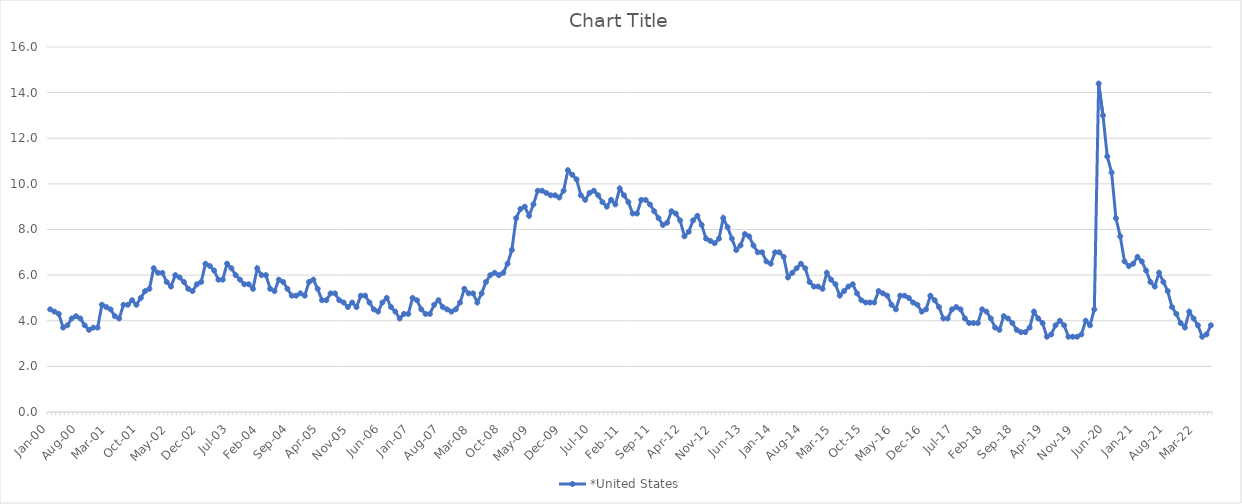
| Category | *United States | Alaska | Alabama | Arkansas | Arizona | California | Colorado | Connecticut | Delaware | Florida | Georgia | Hawaii | Iowa | Idaho | Illinois | Indiana | Kansas | Kentucky | Louisiana | Massachusetts | Maryland | Maine | Michigan | Minnesota | Missouri | Mississippi | Montana | North Carolina | North Dakota | Nebraska | New Hampshire | New Jersey | New Mexico | Nevada | New York | Ohio | Oklahoma | Oregon | Pennsylvania | Rhode Island | South Carolina | South Dakota | Tennessee | Texas | Utah | Virginia | Vermont | Washington | Wisconsin | West Virginia | Wyoming |
|---|---|---|---|---|---|---|---|---|---|---|---|---|---|---|---|---|---|---|---|---|---|---|---|---|---|---|---|---|---|---|---|---|---|---|---|---|---|---|---|---|---|---|---|---|---|---|---|---|---|---|---|
| Jan-00 | 4.5 |  |  |  |  |  |  |  |  |  |  |  |  |  |  |  |  |  |  |  |  |  |  |  |  |  |  |  |  |  |  |  |  |  |  |  |  |  |  |  |  |  |  |  |  |  |  |  |  |  |  |
| Feb-00 | 4.4 |  |  |  |  |  |  |  |  |  |  |  |  |  |  |  |  |  |  |  |  |  |  |  |  |  |  |  |  |  |  |  |  |  |  |  |  |  |  |  |  |  |  |  |  |  |  |  |  |  |  |
| Mar-00 | 4.3 |  |  |  |  |  |  |  |  |  |  |  |  |  |  |  |  |  |  |  |  |  |  |  |  |  |  |  |  |  |  |  |  |  |  |  |  |  |  |  |  |  |  |  |  |  |  |  |  |  |  |
| Apr-00 | 3.7 |  |  |  |  |  |  |  |  |  |  |  |  |  |  |  |  |  |  |  |  |  |  |  |  |  |  |  |  |  |  |  |  |  |  |  |  |  |  |  |  |  |  |  |  |  |  |  |  |  |  |
| May-00 | 3.8 |  |  |  |  |  |  |  |  |  |  |  |  |  |  |  |  |  |  |  |  |  |  |  |  |  |  |  |  |  |  |  |  |  |  |  |  |  |  |  |  |  |  |  |  |  |  |  |  |  |  |
| Jun-00 | 4.1 |  |  |  |  |  |  |  |  |  |  |  |  |  |  |  |  |  |  |  |  |  |  |  |  |  |  |  |  |  |  |  |  |  |  |  |  |  |  |  |  |  |  |  |  |  |  |  |  |  |  |
| Jul-00 | 4.2 |  |  |  |  |  |  |  |  |  |  |  |  |  |  |  |  |  |  |  |  |  |  |  |  |  |  |  |  |  |  |  |  |  |  |  |  |  |  |  |  |  |  |  |  |  |  |  |  |  |  |
| Aug-00 | 4.1 |  |  |  |  |  |  |  |  |  |  |  |  |  |  |  |  |  |  |  |  |  |  |  |  |  |  |  |  |  |  |  |  |  |  |  |  |  |  |  |  |  |  |  |  |  |  |  |  |  |  |
| Sep-00 | 3.8 |  |  |  |  |  |  |  |  |  |  |  |  |  |  |  |  |  |  |  |  |  |  |  |  |  |  |  |  |  |  |  |  |  |  |  |  |  |  |  |  |  |  |  |  |  |  |  |  |  |  |
| Oct-00 | 3.6 |  |  |  |  |  |  |  |  |  |  |  |  |  |  |  |  |  |  |  |  |  |  |  |  |  |  |  |  |  |  |  |  |  |  |  |  |  |  |  |  |  |  |  |  |  |  |  |  |  |  |
| Nov-00 | 3.7 |  |  |  |  |  |  |  |  |  |  |  |  |  |  |  |  |  |  |  |  |  |  |  |  |  |  |  |  |  |  |  |  |  |  |  |  |  |  |  |  |  |  |  |  |  |  |  |  |  |  |
| Dec-00 | 3.7 |  |  |  |  |  |  |  |  |  |  |  |  |  |  |  |  |  |  |  |  |  |  |  |  |  |  |  |  |  |  |  |  |  |  |  |  |  |  |  |  |  |  |  |  |  |  |  |  |  |  |
| Jan-01 | 4.7 |  |  |  |  |  |  |  |  |  |  |  |  |  |  |  |  |  |  |  |  |  |  |  |  |  |  |  |  |  |  |  |  |  |  |  |  |  |  |  |  |  |  |  |  |  |  |  |  |  |  |
| Feb-01 | 4.6 |  |  |  |  |  |  |  |  |  |  |  |  |  |  |  |  |  |  |  |  |  |  |  |  |  |  |  |  |  |  |  |  |  |  |  |  |  |  |  |  |  |  |  |  |  |  |  |  |  |  |
| Mar-01 | 4.5 |  |  |  |  |  |  |  |  |  |  |  |  |  |  |  |  |  |  |  |  |  |  |  |  |  |  |  |  |  |  |  |  |  |  |  |  |  |  |  |  |  |  |  |  |  |  |  |  |  |  |
| Apr-01 | 4.2 |  |  |  |  |  |  |  |  |  |  |  |  |  |  |  |  |  |  |  |  |  |  |  |  |  |  |  |  |  |  |  |  |  |  |  |  |  |  |  |  |  |  |  |  |  |  |  |  |  |  |
| May-01 | 4.1 |  |  |  |  |  |  |  |  |  |  |  |  |  |  |  |  |  |  |  |  |  |  |  |  |  |  |  |  |  |  |  |  |  |  |  |  |  |  |  |  |  |  |  |  |  |  |  |  |  |  |
| Jun-01 | 4.7 |  |  |  |  |  |  |  |  |  |  |  |  |  |  |  |  |  |  |  |  |  |  |  |  |  |  |  |  |  |  |  |  |  |  |  |  |  |  |  |  |  |  |  |  |  |  |  |  |  |  |
| Jul-01 | 4.7 |  |  |  |  |  |  |  |  |  |  |  |  |  |  |  |  |  |  |  |  |  |  |  |  |  |  |  |  |  |  |  |  |  |  |  |  |  |  |  |  |  |  |  |  |  |  |  |  |  |  |
| Aug-01 | 4.9 |  |  |  |  |  |  |  |  |  |  |  |  |  |  |  |  |  |  |  |  |  |  |  |  |  |  |  |  |  |  |  |  |  |  |  |  |  |  |  |  |  |  |  |  |  |  |  |  |  |  |
| Sep-01 | 4.7 |  |  |  |  |  |  |  |  |  |  |  |  |  |  |  |  |  |  |  |  |  |  |  |  |  |  |  |  |  |  |  |  |  |  |  |  |  |  |  |  |  |  |  |  |  |  |  |  |  |  |
| Oct-01 | 5 |  |  |  |  |  |  |  |  |  |  |  |  |  |  |  |  |  |  |  |  |  |  |  |  |  |  |  |  |  |  |  |  |  |  |  |  |  |  |  |  |  |  |  |  |  |  |  |  |  |  |
| Nov-01 | 5.3 |  |  |  |  |  |  |  |  |  |  |  |  |  |  |  |  |  |  |  |  |  |  |  |  |  |  |  |  |  |  |  |  |  |  |  |  |  |  |  |  |  |  |  |  |  |  |  |  |  |  |
| Dec-01 | 5.4 |  |  |  |  |  |  |  |  |  |  |  |  |  |  |  |  |  |  |  |  |  |  |  |  |  |  |  |  |  |  |  |  |  |  |  |  |  |  |  |  |  |  |  |  |  |  |  |  |  |  |
| Jan-02 | 6.3 |  |  |  |  |  |  |  |  |  |  |  |  |  |  |  |  |  |  |  |  |  |  |  |  |  |  |  |  |  |  |  |  |  |  |  |  |  |  |  |  |  |  |  |  |  |  |  |  |  |  |
| Feb-02 | 6.1 |  |  |  |  |  |  |  |  |  |  |  |  |  |  |  |  |  |  |  |  |  |  |  |  |  |  |  |  |  |  |  |  |  |  |  |  |  |  |  |  |  |  |  |  |  |  |  |  |  |  |
| Mar-02 | 6.1 |  |  |  |  |  |  |  |  |  |  |  |  |  |  |  |  |  |  |  |  |  |  |  |  |  |  |  |  |  |  |  |  |  |  |  |  |  |  |  |  |  |  |  |  |  |  |  |  |  |  |
| Apr-02 | 5.7 |  |  |  |  |  |  |  |  |  |  |  |  |  |  |  |  |  |  |  |  |  |  |  |  |  |  |  |  |  |  |  |  |  |  |  |  |  |  |  |  |  |  |  |  |  |  |  |  |  |  |
| May-02 | 5.5 |  |  |  |  |  |  |  |  |  |  |  |  |  |  |  |  |  |  |  |  |  |  |  |  |  |  |  |  |  |  |  |  |  |  |  |  |  |  |  |  |  |  |  |  |  |  |  |  |  |  |
| Jun-02 | 6 |  |  |  |  |  |  |  |  |  |  |  |  |  |  |  |  |  |  |  |  |  |  |  |  |  |  |  |  |  |  |  |  |  |  |  |  |  |  |  |  |  |  |  |  |  |  |  |  |  |  |
| Jul-02 | 5.9 |  |  |  |  |  |  |  |  |  |  |  |  |  |  |  |  |  |  |  |  |  |  |  |  |  |  |  |  |  |  |  |  |  |  |  |  |  |  |  |  |  |  |  |  |  |  |  |  |  |  |
| Aug-02 | 5.7 |  |  |  |  |  |  |  |  |  |  |  |  |  |  |  |  |  |  |  |  |  |  |  |  |  |  |  |  |  |  |  |  |  |  |  |  |  |  |  |  |  |  |  |  |  |  |  |  |  |  |
| Sep-02 | 5.4 |  |  |  |  |  |  |  |  |  |  |  |  |  |  |  |  |  |  |  |  |  |  |  |  |  |  |  |  |  |  |  |  |  |  |  |  |  |  |  |  |  |  |  |  |  |  |  |  |  |  |
| Oct-02 | 5.3 |  |  |  |  |  |  |  |  |  |  |  |  |  |  |  |  |  |  |  |  |  |  |  |  |  |  |  |  |  |  |  |  |  |  |  |  |  |  |  |  |  |  |  |  |  |  |  |  |  |  |
| Nov-02 | 5.6 |  |  |  |  |  |  |  |  |  |  |  |  |  |  |  |  |  |  |  |  |  |  |  |  |  |  |  |  |  |  |  |  |  |  |  |  |  |  |  |  |  |  |  |  |  |  |  |  |  |  |
| Dec-02 | 5.7 |  |  |  |  |  |  |  |  |  |  |  |  |  |  |  |  |  |  |  |  |  |  |  |  |  |  |  |  |  |  |  |  |  |  |  |  |  |  |  |  |  |  |  |  |  |  |  |  |  |  |
| Jan-03 | 6.5 |  |  |  |  |  |  |  |  |  |  |  |  |  |  |  |  |  |  |  |  |  |  |  |  |  |  |  |  |  |  |  |  |  |  |  |  |  |  |  |  |  |  |  |  |  |  |  |  |  |  |
| Feb-03 | 6.4 |  |  |  |  |  |  |  |  |  |  |  |  |  |  |  |  |  |  |  |  |  |  |  |  |  |  |  |  |  |  |  |  |  |  |  |  |  |  |  |  |  |  |  |  |  |  |  |  |  |  |
| Mar-03 | 6.2 |  |  |  |  |  |  |  |  |  |  |  |  |  |  |  |  |  |  |  |  |  |  |  |  |  |  |  |  |  |  |  |  |  |  |  |  |  |  |  |  |  |  |  |  |  |  |  |  |  |  |
| Apr-03 | 5.8 |  |  |  |  |  |  |  |  |  |  |  |  |  |  |  |  |  |  |  |  |  |  |  |  |  |  |  |  |  |  |  |  |  |  |  |  |  |  |  |  |  |  |  |  |  |  |  |  |  |  |
| May-03 | 5.8 |  |  |  |  |  |  |  |  |  |  |  |  |  |  |  |  |  |  |  |  |  |  |  |  |  |  |  |  |  |  |  |  |  |  |  |  |  |  |  |  |  |  |  |  |  |  |  |  |  |  |
| Jun-03 | 6.5 |  |  |  |  |  |  |  |  |  |  |  |  |  |  |  |  |  |  |  |  |  |  |  |  |  |  |  |  |  |  |  |  |  |  |  |  |  |  |  |  |  |  |  |  |  |  |  |  |  |  |
| Jul-03 | 6.3 |  |  |  |  |  |  |  |  |  |  |  |  |  |  |  |  |  |  |  |  |  |  |  |  |  |  |  |  |  |  |  |  |  |  |  |  |  |  |  |  |  |  |  |  |  |  |  |  |  |  |
| Aug-03 | 6 |  |  |  |  |  |  |  |  |  |  |  |  |  |  |  |  |  |  |  |  |  |  |  |  |  |  |  |  |  |  |  |  |  |  |  |  |  |  |  |  |  |  |  |  |  |  |  |  |  |  |
| Sep-03 | 5.8 |  |  |  |  |  |  |  |  |  |  |  |  |  |  |  |  |  |  |  |  |  |  |  |  |  |  |  |  |  |  |  |  |  |  |  |  |  |  |  |  |  |  |  |  |  |  |  |  |  |  |
| Oct-03 | 5.6 |  |  |  |  |  |  |  |  |  |  |  |  |  |  |  |  |  |  |  |  |  |  |  |  |  |  |  |  |  |  |  |  |  |  |  |  |  |  |  |  |  |  |  |  |  |  |  |  |  |  |
| Nov-03 | 5.6 |  |  |  |  |  |  |  |  |  |  |  |  |  |  |  |  |  |  |  |  |  |  |  |  |  |  |  |  |  |  |  |  |  |  |  |  |  |  |  |  |  |  |  |  |  |  |  |  |  |  |
| Dec-03 | 5.4 |  |  |  |  |  |  |  |  |  |  |  |  |  |  |  |  |  |  |  |  |  |  |  |  |  |  |  |  |  |  |  |  |  |  |  |  |  |  |  |  |  |  |  |  |  |  |  |  |  |  |
| Jan-04 | 6.3 |  |  |  |  |  |  |  |  |  |  |  |  |  |  |  |  |  |  |  |  |  |  |  |  |  |  |  |  |  |  |  |  |  |  |  |  |  |  |  |  |  |  |  |  |  |  |  |  |  |  |
| Feb-04 | 6 |  |  |  |  |  |  |  |  |  |  |  |  |  |  |  |  |  |  |  |  |  |  |  |  |  |  |  |  |  |  |  |  |  |  |  |  |  |  |  |  |  |  |  |  |  |  |  |  |  |  |
| Mar-04 | 6 |  |  |  |  |  |  |  |  |  |  |  |  |  |  |  |  |  |  |  |  |  |  |  |  |  |  |  |  |  |  |  |  |  |  |  |  |  |  |  |  |  |  |  |  |  |  |  |  |  |  |
| Apr-04 | 5.4 |  |  |  |  |  |  |  |  |  |  |  |  |  |  |  |  |  |  |  |  |  |  |  |  |  |  |  |  |  |  |  |  |  |  |  |  |  |  |  |  |  |  |  |  |  |  |  |  |  |  |
| May-04 | 5.3 |  |  |  |  |  |  |  |  |  |  |  |  |  |  |  |  |  |  |  |  |  |  |  |  |  |  |  |  |  |  |  |  |  |  |  |  |  |  |  |  |  |  |  |  |  |  |  |  |  |  |
| Jun-04 | 5.8 |  |  |  |  |  |  |  |  |  |  |  |  |  |  |  |  |  |  |  |  |  |  |  |  |  |  |  |  |  |  |  |  |  |  |  |  |  |  |  |  |  |  |  |  |  |  |  |  |  |  |
| Jul-04 | 5.7 |  |  |  |  |  |  |  |  |  |  |  |  |  |  |  |  |  |  |  |  |  |  |  |  |  |  |  |  |  |  |  |  |  |  |  |  |  |  |  |  |  |  |  |  |  |  |  |  |  |  |
| Aug-04 | 5.4 |  |  |  |  |  |  |  |  |  |  |  |  |  |  |  |  |  |  |  |  |  |  |  |  |  |  |  |  |  |  |  |  |  |  |  |  |  |  |  |  |  |  |  |  |  |  |  |  |  |  |
| Sep-04 | 5.1 |  |  |  |  |  |  |  |  |  |  |  |  |  |  |  |  |  |  |  |  |  |  |  |  |  |  |  |  |  |  |  |  |  |  |  |  |  |  |  |  |  |  |  |  |  |  |  |  |  |  |
| Oct-04 | 5.1 |  |  |  |  |  |  |  |  |  |  |  |  |  |  |  |  |  |  |  |  |  |  |  |  |  |  |  |  |  |  |  |  |  |  |  |  |  |  |  |  |  |  |  |  |  |  |  |  |  |  |
| Nov-04 | 5.2 |  |  |  |  |  |  |  |  |  |  |  |  |  |  |  |  |  |  |  |  |  |  |  |  |  |  |  |  |  |  |  |  |  |  |  |  |  |  |  |  |  |  |  |  |  |  |  |  |  |  |
| Dec-04 | 5.1 |  |  |  |  |  |  |  |  |  |  |  |  |  |  |  |  |  |  |  |  |  |  |  |  |  |  |  |  |  |  |  |  |  |  |  |  |  |  |  |  |  |  |  |  |  |  |  |  |  |  |
| Jan-05 | 5.7 |  |  |  |  |  |  |  |  |  |  |  |  |  |  |  |  |  |  |  |  |  |  |  |  |  |  |  |  |  |  |  |  |  |  |  |  |  |  |  |  |  |  |  |  |  |  |  |  |  |  |
| Feb-05 | 5.8 |  |  |  |  |  |  |  |  |  |  |  |  |  |  |  |  |  |  |  |  |  |  |  |  |  |  |  |  |  |  |  |  |  |  |  |  |  |  |  |  |  |  |  |  |  |  |  |  |  |  |
| Mar-05 | 5.4 |  |  |  |  |  |  |  |  |  |  |  |  |  |  |  |  |  |  |  |  |  |  |  |  |  |  |  |  |  |  |  |  |  |  |  |  |  |  |  |  |  |  |  |  |  |  |  |  |  |  |
| Apr-05 | 4.9 |  |  |  |  |  |  |  |  |  |  |  |  |  |  |  |  |  |  |  |  |  |  |  |  |  |  |  |  |  |  |  |  |  |  |  |  |  |  |  |  |  |  |  |  |  |  |  |  |  |  |
| May-05 | 4.9 |  |  |  |  |  |  |  |  |  |  |  |  |  |  |  |  |  |  |  |  |  |  |  |  |  |  |  |  |  |  |  |  |  |  |  |  |  |  |  |  |  |  |  |  |  |  |  |  |  |  |
| Jun-05 | 5.2 |  |  |  |  |  |  |  |  |  |  |  |  |  |  |  |  |  |  |  |  |  |  |  |  |  |  |  |  |  |  |  |  |  |  |  |  |  |  |  |  |  |  |  |  |  |  |  |  |  |  |
| Jul-05 | 5.2 |  |  |  |  |  |  |  |  |  |  |  |  |  |  |  |  |  |  |  |  |  |  |  |  |  |  |  |  |  |  |  |  |  |  |  |  |  |  |  |  |  |  |  |  |  |  |  |  |  |  |
| Aug-05 | 4.9 |  |  |  |  |  |  |  |  |  |  |  |  |  |  |  |  |  |  |  |  |  |  |  |  |  |  |  |  |  |  |  |  |  |  |  |  |  |  |  |  |  |  |  |  |  |  |  |  |  |  |
| Sep-05 | 4.8 |  |  |  |  |  |  |  |  |  |  |  |  |  |  |  |  |  |  |  |  |  |  |  |  |  |  |  |  |  |  |  |  |  |  |  |  |  |  |  |  |  |  |  |  |  |  |  |  |  |  |
| Oct-05 | 4.6 |  |  |  |  |  |  |  |  |  |  |  |  |  |  |  |  |  |  |  |  |  |  |  |  |  |  |  |  |  |  |  |  |  |  |  |  |  |  |  |  |  |  |  |  |  |  |  |  |  |  |
| Nov-05 | 4.8 |  |  |  |  |  |  |  |  |  |  |  |  |  |  |  |  |  |  |  |  |  |  |  |  |  |  |  |  |  |  |  |  |  |  |  |  |  |  |  |  |  |  |  |  |  |  |  |  |  |  |
| Dec-05 | 4.6 |  |  |  |  |  |  |  |  |  |  |  |  |  |  |  |  |  |  |  |  |  |  |  |  |  |  |  |  |  |  |  |  |  |  |  |  |  |  |  |  |  |  |  |  |  |  |  |  |  |  |
| Jan-06 | 5.1 |  |  |  |  |  |  |  |  |  |  |  |  |  |  |  |  |  |  |  |  |  |  |  |  |  |  |  |  |  |  |  |  |  |  |  |  |  |  |  |  |  |  |  |  |  |  |  |  |  |  |
| Feb-06 | 5.1 |  |  |  |  |  |  |  |  |  |  |  |  |  |  |  |  |  |  |  |  |  |  |  |  |  |  |  |  |  |  |  |  |  |  |  |  |  |  |  |  |  |  |  |  |  |  |  |  |  |  |
| Mar-06 | 4.8 |  |  |  |  |  |  |  |  |  |  |  |  |  |  |  |  |  |  |  |  |  |  |  |  |  |  |  |  |  |  |  |  |  |  |  |  |  |  |  |  |  |  |  |  |  |  |  |  |  |  |
| Apr-06 | 4.5 |  |  |  |  |  |  |  |  |  |  |  |  |  |  |  |  |  |  |  |  |  |  |  |  |  |  |  |  |  |  |  |  |  |  |  |  |  |  |  |  |  |  |  |  |  |  |  |  |  |  |
| May-06 | 4.4 |  |  |  |  |  |  |  |  |  |  |  |  |  |  |  |  |  |  |  |  |  |  |  |  |  |  |  |  |  |  |  |  |  |  |  |  |  |  |  |  |  |  |  |  |  |  |  |  |  |  |
| Jun-06 | 4.8 |  |  |  |  |  |  |  |  |  |  |  |  |  |  |  |  |  |  |  |  |  |  |  |  |  |  |  |  |  |  |  |  |  |  |  |  |  |  |  |  |  |  |  |  |  |  |  |  |  |  |
| Jul-06 | 5 |  |  |  |  |  |  |  |  |  |  |  |  |  |  |  |  |  |  |  |  |  |  |  |  |  |  |  |  |  |  |  |  |  |  |  |  |  |  |  |  |  |  |  |  |  |  |  |  |  |  |
| Aug-06 | 4.6 |  |  |  |  |  |  |  |  |  |  |  |  |  |  |  |  |  |  |  |  |  |  |  |  |  |  |  |  |  |  |  |  |  |  |  |  |  |  |  |  |  |  |  |  |  |  |  |  |  |  |
| Sep-06 | 4.4 |  |  |  |  |  |  |  |  |  |  |  |  |  |  |  |  |  |  |  |  |  |  |  |  |  |  |  |  |  |  |  |  |  |  |  |  |  |  |  |  |  |  |  |  |  |  |  |  |  |  |
| Oct-06 | 4.1 |  |  |  |  |  |  |  |  |  |  |  |  |  |  |  |  |  |  |  |  |  |  |  |  |  |  |  |  |  |  |  |  |  |  |  |  |  |  |  |  |  |  |  |  |  |  |  |  |  |  |
| Nov-06 | 4.3 |  |  |  |  |  |  |  |  |  |  |  |  |  |  |  |  |  |  |  |  |  |  |  |  |  |  |  |  |  |  |  |  |  |  |  |  |  |  |  |  |  |  |  |  |  |  |  |  |  |  |
| Dec-06 | 4.3 |  |  |  |  |  |  |  |  |  |  |  |  |  |  |  |  |  |  |  |  |  |  |  |  |  |  |  |  |  |  |  |  |  |  |  |  |  |  |  |  |  |  |  |  |  |  |  |  |  |  |
| Jan-07 | 5 |  |  |  |  |  |  |  |  |  |  |  |  |  |  |  |  |  |  |  |  |  |  |  |  |  |  |  |  |  |  |  |  |  |  |  |  |  |  |  |  |  |  |  |  |  |  |  |  |  |  |
| Feb-07 | 4.9 |  |  |  |  |  |  |  |  |  |  |  |  |  |  |  |  |  |  |  |  |  |  |  |  |  |  |  |  |  |  |  |  |  |  |  |  |  |  |  |  |  |  |  |  |  |  |  |  |  |  |
| Mar-07 | 4.5 |  |  |  |  |  |  |  |  |  |  |  |  |  |  |  |  |  |  |  |  |  |  |  |  |  |  |  |  |  |  |  |  |  |  |  |  |  |  |  |  |  |  |  |  |  |  |  |  |  |  |
| Apr-07 | 4.3 |  |  |  |  |  |  |  |  |  |  |  |  |  |  |  |  |  |  |  |  |  |  |  |  |  |  |  |  |  |  |  |  |  |  |  |  |  |  |  |  |  |  |  |  |  |  |  |  |  |  |
| May-07 | 4.3 |  |  |  |  |  |  |  |  |  |  |  |  |  |  |  |  |  |  |  |  |  |  |  |  |  |  |  |  |  |  |  |  |  |  |  |  |  |  |  |  |  |  |  |  |  |  |  |  |  |  |
| Jun-07 | 4.7 |  |  |  |  |  |  |  |  |  |  |  |  |  |  |  |  |  |  |  |  |  |  |  |  |  |  |  |  |  |  |  |  |  |  |  |  |  |  |  |  |  |  |  |  |  |  |  |  |  |  |
| Jul-07 | 4.9 |  |  |  |  |  |  |  |  |  |  |  |  |  |  |  |  |  |  |  |  |  |  |  |  |  |  |  |  |  |  |  |  |  |  |  |  |  |  |  |  |  |  |  |  |  |  |  |  |  |  |
| Aug-07 | 4.6 |  |  |  |  |  |  |  |  |  |  |  |  |  |  |  |  |  |  |  |  |  |  |  |  |  |  |  |  |  |  |  |  |  |  |  |  |  |  |  |  |  |  |  |  |  |  |  |  |  |  |
| Sep-07 | 4.5 |  |  |  |  |  |  |  |  |  |  |  |  |  |  |  |  |  |  |  |  |  |  |  |  |  |  |  |  |  |  |  |  |  |  |  |  |  |  |  |  |  |  |  |  |  |  |  |  |  |  |
| Oct-07 | 4.4 |  |  |  |  |  |  |  |  |  |  |  |  |  |  |  |  |  |  |  |  |  |  |  |  |  |  |  |  |  |  |  |  |  |  |  |  |  |  |  |  |  |  |  |  |  |  |  |  |  |  |
| Nov-07 | 4.5 |  |  |  |  |  |  |  |  |  |  |  |  |  |  |  |  |  |  |  |  |  |  |  |  |  |  |  |  |  |  |  |  |  |  |  |  |  |  |  |  |  |  |  |  |  |  |  |  |  |  |
| Dec-07 | 4.8 |  |  |  |  |  |  |  |  |  |  |  |  |  |  |  |  |  |  |  |  |  |  |  |  |  |  |  |  |  |  |  |  |  |  |  |  |  |  |  |  |  |  |  |  |  |  |  |  |  |  |
| Jan-08 | 5.4 |  |  |  |  |  |  |  |  |  |  |  |  |  |  |  |  |  |  |  |  |  |  |  |  |  |  |  |  |  |  |  |  |  |  |  |  |  |  |  |  |  |  |  |  |  |  |  |  |  |  |
| Feb-08 | 5.2 |  |  |  |  |  |  |  |  |  |  |  |  |  |  |  |  |  |  |  |  |  |  |  |  |  |  |  |  |  |  |  |  |  |  |  |  |  |  |  |  |  |  |  |  |  |  |  |  |  |  |
| Mar-08 | 5.2 |  |  |  |  |  |  |  |  |  |  |  |  |  |  |  |  |  |  |  |  |  |  |  |  |  |  |  |  |  |  |  |  |  |  |  |  |  |  |  |  |  |  |  |  |  |  |  |  |  |  |
| Apr-08 | 4.8 |  |  |  |  |  |  |  |  |  |  |  |  |  |  |  |  |  |  |  |  |  |  |  |  |  |  |  |  |  |  |  |  |  |  |  |  |  |  |  |  |  |  |  |  |  |  |  |  |  |  |
| May-08 | 5.2 |  |  |  |  |  |  |  |  |  |  |  |  |  |  |  |  |  |  |  |  |  |  |  |  |  |  |  |  |  |  |  |  |  |  |  |  |  |  |  |  |  |  |  |  |  |  |  |  |  |  |
| Jun-08 | 5.7 |  |  |  |  |  |  |  |  |  |  |  |  |  |  |  |  |  |  |  |  |  |  |  |  |  |  |  |  |  |  |  |  |  |  |  |  |  |  |  |  |  |  |  |  |  |  |  |  |  |  |
| Jul-08 | 6 |  |  |  |  |  |  |  |  |  |  |  |  |  |  |  |  |  |  |  |  |  |  |  |  |  |  |  |  |  |  |  |  |  |  |  |  |  |  |  |  |  |  |  |  |  |  |  |  |  |  |
| Aug-08 | 6.1 |  |  |  |  |  |  |  |  |  |  |  |  |  |  |  |  |  |  |  |  |  |  |  |  |  |  |  |  |  |  |  |  |  |  |  |  |  |  |  |  |  |  |  |  |  |  |  |  |  |  |
| Sep-08 | 6 |  |  |  |  |  |  |  |  |  |  |  |  |  |  |  |  |  |  |  |  |  |  |  |  |  |  |  |  |  |  |  |  |  |  |  |  |  |  |  |  |  |  |  |  |  |  |  |  |  |  |
| Oct-08 | 6.1 |  |  |  |  |  |  |  |  |  |  |  |  |  |  |  |  |  |  |  |  |  |  |  |  |  |  |  |  |  |  |  |  |  |  |  |  |  |  |  |  |  |  |  |  |  |  |  |  |  |  |
| Nov-08 | 6.5 |  |  |  |  |  |  |  |  |  |  |  |  |  |  |  |  |  |  |  |  |  |  |  |  |  |  |  |  |  |  |  |  |  |  |  |  |  |  |  |  |  |  |  |  |  |  |  |  |  |  |
| Dec-08 | 7.1 |  |  |  |  |  |  |  |  |  |  |  |  |  |  |  |  |  |  |  |  |  |  |  |  |  |  |  |  |  |  |  |  |  |  |  |  |  |  |  |  |  |  |  |  |  |  |  |  |  |  |
| Jan-09 | 8.5 |  |  |  |  |  |  |  |  |  |  |  |  |  |  |  |  |  |  |  |  |  |  |  |  |  |  |  |  |  |  |  |  |  |  |  |  |  |  |  |  |  |  |  |  |  |  |  |  |  |  |
| Feb-09 | 8.9 |  |  |  |  |  |  |  |  |  |  |  |  |  |  |  |  |  |  |  |  |  |  |  |  |  |  |  |  |  |  |  |  |  |  |  |  |  |  |  |  |  |  |  |  |  |  |  |  |  |  |
| Mar-09 | 9 |  |  |  |  |  |  |  |  |  |  |  |  |  |  |  |  |  |  |  |  |  |  |  |  |  |  |  |  |  |  |  |  |  |  |  |  |  |  |  |  |  |  |  |  |  |  |  |  |  |  |
| Apr-09 | 8.6 |  |  |  |  |  |  |  |  |  |  |  |  |  |  |  |  |  |  |  |  |  |  |  |  |  |  |  |  |  |  |  |  |  |  |  |  |  |  |  |  |  |  |  |  |  |  |  |  |  |  |
| May-09 | 9.1 |  |  |  |  |  |  |  |  |  |  |  |  |  |  |  |  |  |  |  |  |  |  |  |  |  |  |  |  |  |  |  |  |  |  |  |  |  |  |  |  |  |  |  |  |  |  |  |  |  |  |
| Jun-09 | 9.7 |  |  |  |  |  |  |  |  |  |  |  |  |  |  |  |  |  |  |  |  |  |  |  |  |  |  |  |  |  |  |  |  |  |  |  |  |  |  |  |  |  |  |  |  |  |  |  |  |  |  |
| Jul-09 | 9.7 |  |  |  |  |  |  |  |  |  |  |  |  |  |  |  |  |  |  |  |  |  |  |  |  |  |  |  |  |  |  |  |  |  |  |  |  |  |  |  |  |  |  |  |  |  |  |  |  |  |  |
| Aug-09 | 9.6 |  |  |  |  |  |  |  |  |  |  |  |  |  |  |  |  |  |  |  |  |  |  |  |  |  |  |  |  |  |  |  |  |  |  |  |  |  |  |  |  |  |  |  |  |  |  |  |  |  |  |
| Sep-09 | 9.5 |  |  |  |  |  |  |  |  |  |  |  |  |  |  |  |  |  |  |  |  |  |  |  |  |  |  |  |  |  |  |  |  |  |  |  |  |  |  |  |  |  |  |  |  |  |  |  |  |  |  |
| Oct-09 | 9.5 |  |  |  |  |  |  |  |  |  |  |  |  |  |  |  |  |  |  |  |  |  |  |  |  |  |  |  |  |  |  |  |  |  |  |  |  |  |  |  |  |  |  |  |  |  |  |  |  |  |  |
| Nov-09 | 9.4 |  |  |  |  |  |  |  |  |  |  |  |  |  |  |  |  |  |  |  |  |  |  |  |  |  |  |  |  |  |  |  |  |  |  |  |  |  |  |  |  |  |  |  |  |  |  |  |  |  |  |
| Dec-09 | 9.7 |  |  |  |  |  |  |  |  |  |  |  |  |  |  |  |  |  |  |  |  |  |  |  |  |  |  |  |  |  |  |  |  |  |  |  |  |  |  |  |  |  |  |  |  |  |  |  |  |  |  |
| Jan-10 | 10.6 |  |  |  |  |  |  |  |  |  |  |  |  |  |  |  |  |  |  |  |  |  |  |  |  |  |  |  |  |  |  |  |  |  |  |  |  |  |  |  |  |  |  |  |  |  |  |  |  |  |  |
| Feb-10 | 10.4 |  |  |  |  |  |  |  |  |  |  |  |  |  |  |  |  |  |  |  |  |  |  |  |  |  |  |  |  |  |  |  |  |  |  |  |  |  |  |  |  |  |  |  |  |  |  |  |  |  |  |
| Mar-10 | 10.2 |  |  |  |  |  |  |  |  |  |  |  |  |  |  |  |  |  |  |  |  |  |  |  |  |  |  |  |  |  |  |  |  |  |  |  |  |  |  |  |  |  |  |  |  |  |  |  |  |  |  |
| Apr-10 | 9.5 |  |  |  |  |  |  |  |  |  |  |  |  |  |  |  |  |  |  |  |  |  |  |  |  |  |  |  |  |  |  |  |  |  |  |  |  |  |  |  |  |  |  |  |  |  |  |  |  |  |  |
| May-10 | 9.3 |  |  |  |  |  |  |  |  |  |  |  |  |  |  |  |  |  |  |  |  |  |  |  |  |  |  |  |  |  |  |  |  |  |  |  |  |  |  |  |  |  |  |  |  |  |  |  |  |  |  |
| Jun-10 | 9.6 |  |  |  |  |  |  |  |  |  |  |  |  |  |  |  |  |  |  |  |  |  |  |  |  |  |  |  |  |  |  |  |  |  |  |  |  |  |  |  |  |  |  |  |  |  |  |  |  |  |  |
| Jul-10 | 9.7 |  |  |  |  |  |  |  |  |  |  |  |  |  |  |  |  |  |  |  |  |  |  |  |  |  |  |  |  |  |  |  |  |  |  |  |  |  |  |  |  |  |  |  |  |  |  |  |  |  |  |
| Aug-10 | 9.5 |  |  |  |  |  |  |  |  |  |  |  |  |  |  |  |  |  |  |  |  |  |  |  |  |  |  |  |  |  |  |  |  |  |  |  |  |  |  |  |  |  |  |  |  |  |  |  |  |  |  |
| Sep-10 | 9.2 |  |  |  |  |  |  |  |  |  |  |  |  |  |  |  |  |  |  |  |  |  |  |  |  |  |  |  |  |  |  |  |  |  |  |  |  |  |  |  |  |  |  |  |  |  |  |  |  |  |  |
| Oct-10 | 9 |  |  |  |  |  |  |  |  |  |  |  |  |  |  |  |  |  |  |  |  |  |  |  |  |  |  |  |  |  |  |  |  |  |  |  |  |  |  |  |  |  |  |  |  |  |  |  |  |  |  |
| Nov-10 | 9.3 |  |  |  |  |  |  |  |  |  |  |  |  |  |  |  |  |  |  |  |  |  |  |  |  |  |  |  |  |  |  |  |  |  |  |  |  |  |  |  |  |  |  |  |  |  |  |  |  |  |  |
| Dec-10 | 9.1 |  |  |  |  |  |  |  |  |  |  |  |  |  |  |  |  |  |  |  |  |  |  |  |  |  |  |  |  |  |  |  |  |  |  |  |  |  |  |  |  |  |  |  |  |  |  |  |  |  |  |
| Jan-11 | 9.8 |  |  |  |  |  |  |  |  |  |  |  |  |  |  |  |  |  |  |  |  |  |  |  |  |  |  |  |  |  |  |  |  |  |  |  |  |  |  |  |  |  |  |  |  |  |  |  |  |  |  |
| Feb-11 | 9.5 |  |  |  |  |  |  |  |  |  |  |  |  |  |  |  |  |  |  |  |  |  |  |  |  |  |  |  |  |  |  |  |  |  |  |  |  |  |  |  |  |  |  |  |  |  |  |  |  |  |  |
| Mar-11 | 9.2 |  |  |  |  |  |  |  |  |  |  |  |  |  |  |  |  |  |  |  |  |  |  |  |  |  |  |  |  |  |  |  |  |  |  |  |  |  |  |  |  |  |  |  |  |  |  |  |  |  |  |
| Apr-11 | 8.7 |  |  |  |  |  |  |  |  |  |  |  |  |  |  |  |  |  |  |  |  |  |  |  |  |  |  |  |  |  |  |  |  |  |  |  |  |  |  |  |  |  |  |  |  |  |  |  |  |  |  |
| May-11 | 8.7 |  |  |  |  |  |  |  |  |  |  |  |  |  |  |  |  |  |  |  |  |  |  |  |  |  |  |  |  |  |  |  |  |  |  |  |  |  |  |  |  |  |  |  |  |  |  |  |  |  |  |
| Jun-11 | 9.3 |  |  |  |  |  |  |  |  |  |  |  |  |  |  |  |  |  |  |  |  |  |  |  |  |  |  |  |  |  |  |  |  |  |  |  |  |  |  |  |  |  |  |  |  |  |  |  |  |  |  |
| Jul-11 | 9.3 |  |  |  |  |  |  |  |  |  |  |  |  |  |  |  |  |  |  |  |  |  |  |  |  |  |  |  |  |  |  |  |  |  |  |  |  |  |  |  |  |  |  |  |  |  |  |  |  |  |  |
| Aug-11 | 9.1 |  |  |  |  |  |  |  |  |  |  |  |  |  |  |  |  |  |  |  |  |  |  |  |  |  |  |  |  |  |  |  |  |  |  |  |  |  |  |  |  |  |  |  |  |  |  |  |  |  |  |
| Sep-11 | 8.8 |  |  |  |  |  |  |  |  |  |  |  |  |  |  |  |  |  |  |  |  |  |  |  |  |  |  |  |  |  |  |  |  |  |  |  |  |  |  |  |  |  |  |  |  |  |  |  |  |  |  |
| Oct-11 | 8.5 |  |  |  |  |  |  |  |  |  |  |  |  |  |  |  |  |  |  |  |  |  |  |  |  |  |  |  |  |  |  |  |  |  |  |  |  |  |  |  |  |  |  |  |  |  |  |  |  |  |  |
| Nov-11 | 8.2 |  |  |  |  |  |  |  |  |  |  |  |  |  |  |  |  |  |  |  |  |  |  |  |  |  |  |  |  |  |  |  |  |  |  |  |  |  |  |  |  |  |  |  |  |  |  |  |  |  |  |
| Dec-11 | 8.3 |  |  |  |  |  |  |  |  |  |  |  |  |  |  |  |  |  |  |  |  |  |  |  |  |  |  |  |  |  |  |  |  |  |  |  |  |  |  |  |  |  |  |  |  |  |  |  |  |  |  |
| Jan-12 | 8.8 |  |  |  |  |  |  |  |  |  |  |  |  |  |  |  |  |  |  |  |  |  |  |  |  |  |  |  |  |  |  |  |  |  |  |  |  |  |  |  |  |  |  |  |  |  |  |  |  |  |  |
| Feb-12 | 8.7 |  |  |  |  |  |  |  |  |  |  |  |  |  |  |  |  |  |  |  |  |  |  |  |  |  |  |  |  |  |  |  |  |  |  |  |  |  |  |  |  |  |  |  |  |  |  |  |  |  |  |
| Mar-12 | 8.4 |  |  |  |  |  |  |  |  |  |  |  |  |  |  |  |  |  |  |  |  |  |  |  |  |  |  |  |  |  |  |  |  |  |  |  |  |  |  |  |  |  |  |  |  |  |  |  |  |  |  |
| Apr-12 | 7.7 |  |  |  |  |  |  |  |  |  |  |  |  |  |  |  |  |  |  |  |  |  |  |  |  |  |  |  |  |  |  |  |  |  |  |  |  |  |  |  |  |  |  |  |  |  |  |  |  |  |  |
| May-12 | 7.9 |  |  |  |  |  |  |  |  |  |  |  |  |  |  |  |  |  |  |  |  |  |  |  |  |  |  |  |  |  |  |  |  |  |  |  |  |  |  |  |  |  |  |  |  |  |  |  |  |  |  |
| Jun-12 | 8.4 |  |  |  |  |  |  |  |  |  |  |  |  |  |  |  |  |  |  |  |  |  |  |  |  |  |  |  |  |  |  |  |  |  |  |  |  |  |  |  |  |  |  |  |  |  |  |  |  |  |  |
| Jul-12 | 8.6 |  |  |  |  |  |  |  |  |  |  |  |  |  |  |  |  |  |  |  |  |  |  |  |  |  |  |  |  |  |  |  |  |  |  |  |  |  |  |  |  |  |  |  |  |  |  |  |  |  |  |
| Aug-12 | 8.2 |  |  |  |  |  |  |  |  |  |  |  |  |  |  |  |  |  |  |  |  |  |  |  |  |  |  |  |  |  |  |  |  |  |  |  |  |  |  |  |  |  |  |  |  |  |  |  |  |  |  |
| Sep-12 | 7.6 |  |  |  |  |  |  |  |  |  |  |  |  |  |  |  |  |  |  |  |  |  |  |  |  |  |  |  |  |  |  |  |  |  |  |  |  |  |  |  |  |  |  |  |  |  |  |  |  |  |  |
| Oct-12 | 7.5 |  |  |  |  |  |  |  |  |  |  |  |  |  |  |  |  |  |  |  |  |  |  |  |  |  |  |  |  |  |  |  |  |  |  |  |  |  |  |  |  |  |  |  |  |  |  |  |  |  |  |
| Nov-12 | 7.4 |  |  |  |  |  |  |  |  |  |  |  |  |  |  |  |  |  |  |  |  |  |  |  |  |  |  |  |  |  |  |  |  |  |  |  |  |  |  |  |  |  |  |  |  |  |  |  |  |  |  |
| Dec-12 | 7.6 |  |  |  |  |  |  |  |  |  |  |  |  |  |  |  |  |  |  |  |  |  |  |  |  |  |  |  |  |  |  |  |  |  |  |  |  |  |  |  |  |  |  |  |  |  |  |  |  |  |  |
| Jan-13 | 8.5 |  |  |  |  |  |  |  |  |  |  |  |  |  |  |  |  |  |  |  |  |  |  |  |  |  |  |  |  |  |  |  |  |  |  |  |  |  |  |  |  |  |  |  |  |  |  |  |  |  |  |
| Feb-13 | 8.1 |  |  |  |  |  |  |  |  |  |  |  |  |  |  |  |  |  |  |  |  |  |  |  |  |  |  |  |  |  |  |  |  |  |  |  |  |  |  |  |  |  |  |  |  |  |  |  |  |  |  |
| Mar-13 | 7.6 |  |  |  |  |  |  |  |  |  |  |  |  |  |  |  |  |  |  |  |  |  |  |  |  |  |  |  |  |  |  |  |  |  |  |  |  |  |  |  |  |  |  |  |  |  |  |  |  |  |  |
| Apr-13 | 7.1 |  |  |  |  |  |  |  |  |  |  |  |  |  |  |  |  |  |  |  |  |  |  |  |  |  |  |  |  |  |  |  |  |  |  |  |  |  |  |  |  |  |  |  |  |  |  |  |  |  |  |
| May-13 | 7.3 |  |  |  |  |  |  |  |  |  |  |  |  |  |  |  |  |  |  |  |  |  |  |  |  |  |  |  |  |  |  |  |  |  |  |  |  |  |  |  |  |  |  |  |  |  |  |  |  |  |  |
| Jun-13 | 7.8 |  |  |  |  |  |  |  |  |  |  |  |  |  |  |  |  |  |  |  |  |  |  |  |  |  |  |  |  |  |  |  |  |  |  |  |  |  |  |  |  |  |  |  |  |  |  |  |  |  |  |
| Jul-13 | 7.7 |  |  |  |  |  |  |  |  |  |  |  |  |  |  |  |  |  |  |  |  |  |  |  |  |  |  |  |  |  |  |  |  |  |  |  |  |  |  |  |  |  |  |  |  |  |  |  |  |  |  |
| Aug-13 | 7.3 |  |  |  |  |  |  |  |  |  |  |  |  |  |  |  |  |  |  |  |  |  |  |  |  |  |  |  |  |  |  |  |  |  |  |  |  |  |  |  |  |  |  |  |  |  |  |  |  |  |  |
| Sep-13 | 7 |  |  |  |  |  |  |  |  |  |  |  |  |  |  |  |  |  |  |  |  |  |  |  |  |  |  |  |  |  |  |  |  |  |  |  |  |  |  |  |  |  |  |  |  |  |  |  |  |  |  |
| Oct-13 | 7 |  |  |  |  |  |  |  |  |  |  |  |  |  |  |  |  |  |  |  |  |  |  |  |  |  |  |  |  |  |  |  |  |  |  |  |  |  |  |  |  |  |  |  |  |  |  |  |  |  |  |
| Nov-13 | 6.6 |  |  |  |  |  |  |  |  |  |  |  |  |  |  |  |  |  |  |  |  |  |  |  |  |  |  |  |  |  |  |  |  |  |  |  |  |  |  |  |  |  |  |  |  |  |  |  |  |  |  |
| Dec-13 | 6.5 |  |  |  |  |  |  |  |  |  |  |  |  |  |  |  |  |  |  |  |  |  |  |  |  |  |  |  |  |  |  |  |  |  |  |  |  |  |  |  |  |  |  |  |  |  |  |  |  |  |  |
| Jan-14 | 7 |  |  |  |  |  |  |  |  |  |  |  |  |  |  |  |  |  |  |  |  |  |  |  |  |  |  |  |  |  |  |  |  |  |  |  |  |  |  |  |  |  |  |  |  |  |  |  |  |  |  |
| Feb-14 | 7 |  |  |  |  |  |  |  |  |  |  |  |  |  |  |  |  |  |  |  |  |  |  |  |  |  |  |  |  |  |  |  |  |  |  |  |  |  |  |  |  |  |  |  |  |  |  |  |  |  |  |
| Mar-14 | 6.8 |  |  |  |  |  |  |  |  |  |  |  |  |  |  |  |  |  |  |  |  |  |  |  |  |  |  |  |  |  |  |  |  |  |  |  |  |  |  |  |  |  |  |  |  |  |  |  |  |  |  |
| Apr-14 | 5.9 |  |  |  |  |  |  |  |  |  |  |  |  |  |  |  |  |  |  |  |  |  |  |  |  |  |  |  |  |  |  |  |  |  |  |  |  |  |  |  |  |  |  |  |  |  |  |  |  |  |  |
| May-14 | 6.1 |  |  |  |  |  |  |  |  |  |  |  |  |  |  |  |  |  |  |  |  |  |  |  |  |  |  |  |  |  |  |  |  |  |  |  |  |  |  |  |  |  |  |  |  |  |  |  |  |  |  |
| Jun-14 | 6.3 |  |  |  |  |  |  |  |  |  |  |  |  |  |  |  |  |  |  |  |  |  |  |  |  |  |  |  |  |  |  |  |  |  |  |  |  |  |  |  |  |  |  |  |  |  |  |  |  |  |  |
| Jul-14 | 6.5 |  |  |  |  |  |  |  |  |  |  |  |  |  |  |  |  |  |  |  |  |  |  |  |  |  |  |  |  |  |  |  |  |  |  |  |  |  |  |  |  |  |  |  |  |  |  |  |  |  |  |
| Aug-14 | 6.3 |  |  |  |  |  |  |  |  |  |  |  |  |  |  |  |  |  |  |  |  |  |  |  |  |  |  |  |  |  |  |  |  |  |  |  |  |  |  |  |  |  |  |  |  |  |  |  |  |  |  |
| Sep-14 | 5.7 |  |  |  |  |  |  |  |  |  |  |  |  |  |  |  |  |  |  |  |  |  |  |  |  |  |  |  |  |  |  |  |  |  |  |  |  |  |  |  |  |  |  |  |  |  |  |  |  |  |  |
| Oct-14 | 5.5 |  |  |  |  |  |  |  |  |  |  |  |  |  |  |  |  |  |  |  |  |  |  |  |  |  |  |  |  |  |  |  |  |  |  |  |  |  |  |  |  |  |  |  |  |  |  |  |  |  |  |
| Nov-14 | 5.5 |  |  |  |  |  |  |  |  |  |  |  |  |  |  |  |  |  |  |  |  |  |  |  |  |  |  |  |  |  |  |  |  |  |  |  |  |  |  |  |  |  |  |  |  |  |  |  |  |  |  |
| Dec-14 | 5.4 |  |  |  |  |  |  |  |  |  |  |  |  |  |  |  |  |  |  |  |  |  |  |  |  |  |  |  |  |  |  |  |  |  |  |  |  |  |  |  |  |  |  |  |  |  |  |  |  |  |  |
| Jan-15 | 6.1 |  |  |  |  |  |  |  |  |  |  |  |  |  |  |  |  |  |  |  |  |  |  |  |  |  |  |  |  |  |  |  |  |  |  |  |  |  |  |  |  |  |  |  |  |  |  |  |  |  |  |
| Feb-15 | 5.8 |  |  |  |  |  |  |  |  |  |  |  |  |  |  |  |  |  |  |  |  |  |  |  |  |  |  |  |  |  |  |  |  |  |  |  |  |  |  |  |  |  |  |  |  |  |  |  |  |  |  |
| Mar-15 | 5.6 |  |  |  |  |  |  |  |  |  |  |  |  |  |  |  |  |  |  |  |  |  |  |  |  |  |  |  |  |  |  |  |  |  |  |  |  |  |  |  |  |  |  |  |  |  |  |  |  |  |  |
| Apr-15 | 5.1 |  |  |  |  |  |  |  |  |  |  |  |  |  |  |  |  |  |  |  |  |  |  |  |  |  |  |  |  |  |  |  |  |  |  |  |  |  |  |  |  |  |  |  |  |  |  |  |  |  |  |
| May-15 | 5.3 |  |  |  |  |  |  |  |  |  |  |  |  |  |  |  |  |  |  |  |  |  |  |  |  |  |  |  |  |  |  |  |  |  |  |  |  |  |  |  |  |  |  |  |  |  |  |  |  |  |  |
| Jun-15 | 5.5 |  |  |  |  |  |  |  |  |  |  |  |  |  |  |  |  |  |  |  |  |  |  |  |  |  |  |  |  |  |  |  |  |  |  |  |  |  |  |  |  |  |  |  |  |  |  |  |  |  |  |
| Jul-15 | 5.6 |  |  |  |  |  |  |  |  |  |  |  |  |  |  |  |  |  |  |  |  |  |  |  |  |  |  |  |  |  |  |  |  |  |  |  |  |  |  |  |  |  |  |  |  |  |  |  |  |  |  |
| Aug-15 | 5.2 |  |  |  |  |  |  |  |  |  |  |  |  |  |  |  |  |  |  |  |  |  |  |  |  |  |  |  |  |  |  |  |  |  |  |  |  |  |  |  |  |  |  |  |  |  |  |  |  |  |  |
| Sep-15 | 4.9 |  |  |  |  |  |  |  |  |  |  |  |  |  |  |  |  |  |  |  |  |  |  |  |  |  |  |  |  |  |  |  |  |  |  |  |  |  |  |  |  |  |  |  |  |  |  |  |  |  |  |
| Oct-15 | 4.8 |  |  |  |  |  |  |  |  |  |  |  |  |  |  |  |  |  |  |  |  |  |  |  |  |  |  |  |  |  |  |  |  |  |  |  |  |  |  |  |  |  |  |  |  |  |  |  |  |  |  |
| Nov-15 | 4.8 |  |  |  |  |  |  |  |  |  |  |  |  |  |  |  |  |  |  |  |  |  |  |  |  |  |  |  |  |  |  |  |  |  |  |  |  |  |  |  |  |  |  |  |  |  |  |  |  |  |  |
| Dec-15 | 4.8 |  |  |  |  |  |  |  |  |  |  |  |  |  |  |  |  |  |  |  |  |  |  |  |  |  |  |  |  |  |  |  |  |  |  |  |  |  |  |  |  |  |  |  |  |  |  |  |  |  |  |
| Jan-16 | 5.3 |  |  |  |  |  |  |  |  |  |  |  |  |  |  |  |  |  |  |  |  |  |  |  |  |  |  |  |  |  |  |  |  |  |  |  |  |  |  |  |  |  |  |  |  |  |  |  |  |  |  |
| Feb-16 | 5.2 |  |  |  |  |  |  |  |  |  |  |  |  |  |  |  |  |  |  |  |  |  |  |  |  |  |  |  |  |  |  |  |  |  |  |  |  |  |  |  |  |  |  |  |  |  |  |  |  |  |  |
| Mar-16 | 5.1 |  |  |  |  |  |  |  |  |  |  |  |  |  |  |  |  |  |  |  |  |  |  |  |  |  |  |  |  |  |  |  |  |  |  |  |  |  |  |  |  |  |  |  |  |  |  |  |  |  |  |
| Apr-16 | 4.7 |  |  |  |  |  |  |  |  |  |  |  |  |  |  |  |  |  |  |  |  |  |  |  |  |  |  |  |  |  |  |  |  |  |  |  |  |  |  |  |  |  |  |  |  |  |  |  |  |  |  |
| May-16 | 4.5 |  |  |  |  |  |  |  |  |  |  |  |  |  |  |  |  |  |  |  |  |  |  |  |  |  |  |  |  |  |  |  |  |  |  |  |  |  |  |  |  |  |  |  |  |  |  |  |  |  |  |
| Jun-16 | 5.1 |  |  |  |  |  |  |  |  |  |  |  |  |  |  |  |  |  |  |  |  |  |  |  |  |  |  |  |  |  |  |  |  |  |  |  |  |  |  |  |  |  |  |  |  |  |  |  |  |  |  |
| Jul-16 | 5.1 |  |  |  |  |  |  |  |  |  |  |  |  |  |  |  |  |  |  |  |  |  |  |  |  |  |  |  |  |  |  |  |  |  |  |  |  |  |  |  |  |  |  |  |  |  |  |  |  |  |  |
| Aug-16 | 5 |  |  |  |  |  |  |  |  |  |  |  |  |  |  |  |  |  |  |  |  |  |  |  |  |  |  |  |  |  |  |  |  |  |  |  |  |  |  |  |  |  |  |  |  |  |  |  |  |  |  |
| Sep-16 | 4.8 |  |  |  |  |  |  |  |  |  |  |  |  |  |  |  |  |  |  |  |  |  |  |  |  |  |  |  |  |  |  |  |  |  |  |  |  |  |  |  |  |  |  |  |  |  |  |  |  |  |  |
| Oct-16 | 4.7 |  |  |  |  |  |  |  |  |  |  |  |  |  |  |  |  |  |  |  |  |  |  |  |  |  |  |  |  |  |  |  |  |  |  |  |  |  |  |  |  |  |  |  |  |  |  |  |  |  |  |
| Nov-16 | 4.4 |  |  |  |  |  |  |  |  |  |  |  |  |  |  |  |  |  |  |  |  |  |  |  |  |  |  |  |  |  |  |  |  |  |  |  |  |  |  |  |  |  |  |  |  |  |  |  |  |  |  |
| Dec-16 | 4.5 |  |  |  |  |  |  |  |  |  |  |  |  |  |  |  |  |  |  |  |  |  |  |  |  |  |  |  |  |  |  |  |  |  |  |  |  |  |  |  |  |  |  |  |  |  |  |  |  |  |  |
| Jan-17 | 5.1 |  |  |  |  |  |  |  |  |  |  |  |  |  |  |  |  |  |  |  |  |  |  |  |  |  |  |  |  |  |  |  |  |  |  |  |  |  |  |  |  |  |  |  |  |  |  |  |  |  |  |
| Feb-17 | 4.9 |  |  |  |  |  |  |  |  |  |  |  |  |  |  |  |  |  |  |  |  |  |  |  |  |  |  |  |  |  |  |  |  |  |  |  |  |  |  |  |  |  |  |  |  |  |  |  |  |  |  |
| Mar-17 | 4.6 |  |  |  |  |  |  |  |  |  |  |  |  |  |  |  |  |  |  |  |  |  |  |  |  |  |  |  |  |  |  |  |  |  |  |  |  |  |  |  |  |  |  |  |  |  |  |  |  |  |  |
| Apr-17 | 4.1 |  |  |  |  |  |  |  |  |  |  |  |  |  |  |  |  |  |  |  |  |  |  |  |  |  |  |  |  |  |  |  |  |  |  |  |  |  |  |  |  |  |  |  |  |  |  |  |  |  |  |
| May-17 | 4.1 |  |  |  |  |  |  |  |  |  |  |  |  |  |  |  |  |  |  |  |  |  |  |  |  |  |  |  |  |  |  |  |  |  |  |  |  |  |  |  |  |  |  |  |  |  |  |  |  |  |  |
| Jun-17 | 4.5 |  |  |  |  |  |  |  |  |  |  |  |  |  |  |  |  |  |  |  |  |  |  |  |  |  |  |  |  |  |  |  |  |  |  |  |  |  |  |  |  |  |  |  |  |  |  |  |  |  |  |
| Jul-17 | 4.6 |  |  |  |  |  |  |  |  |  |  |  |  |  |  |  |  |  |  |  |  |  |  |  |  |  |  |  |  |  |  |  |  |  |  |  |  |  |  |  |  |  |  |  |  |  |  |  |  |  |  |
| Aug-17 | 4.5 |  |  |  |  |  |  |  |  |  |  |  |  |  |  |  |  |  |  |  |  |  |  |  |  |  |  |  |  |  |  |  |  |  |  |  |  |  |  |  |  |  |  |  |  |  |  |  |  |  |  |
| Sep-17 | 4.1 |  |  |  |  |  |  |  |  |  |  |  |  |  |  |  |  |  |  |  |  |  |  |  |  |  |  |  |  |  |  |  |  |  |  |  |  |  |  |  |  |  |  |  |  |  |  |  |  |  |  |
| Oct-17 | 3.9 |  |  |  |  |  |  |  |  |  |  |  |  |  |  |  |  |  |  |  |  |  |  |  |  |  |  |  |  |  |  |  |  |  |  |  |  |  |  |  |  |  |  |  |  |  |  |  |  |  |  |
| Nov-17 | 3.9 |  |  |  |  |  |  |  |  |  |  |  |  |  |  |  |  |  |  |  |  |  |  |  |  |  |  |  |  |  |  |  |  |  |  |  |  |  |  |  |  |  |  |  |  |  |  |  |  |  |  |
| Dec-17 | 3.9 |  |  |  |  |  |  |  |  |  |  |  |  |  |  |  |  |  |  |  |  |  |  |  |  |  |  |  |  |  |  |  |  |  |  |  |  |  |  |  |  |  |  |  |  |  |  |  |  |  |  |
| Jan-18 | 4.5 |  |  |  |  |  |  |  |  |  |  |  |  |  |  |  |  |  |  |  |  |  |  |  |  |  |  |  |  |  |  |  |  |  |  |  |  |  |  |  |  |  |  |  |  |  |  |  |  |  |  |
| Feb-18 | 4.4 |  |  |  |  |  |  |  |  |  |  |  |  |  |  |  |  |  |  |  |  |  |  |  |  |  |  |  |  |  |  |  |  |  |  |  |  |  |  |  |  |  |  |  |  |  |  |  |  |  |  |
| Mar-18 | 4.1 |  |  |  |  |  |  |  |  |  |  |  |  |  |  |  |  |  |  |  |  |  |  |  |  |  |  |  |  |  |  |  |  |  |  |  |  |  |  |  |  |  |  |  |  |  |  |  |  |  |  |
| Apr-18 | 3.7 |  |  |  |  |  |  |  |  |  |  |  |  |  |  |  |  |  |  |  |  |  |  |  |  |  |  |  |  |  |  |  |  |  |  |  |  |  |  |  |  |  |  |  |  |  |  |  |  |  |  |
| May-18 | 3.6 |  |  |  |  |  |  |  |  |  |  |  |  |  |  |  |  |  |  |  |  |  |  |  |  |  |  |  |  |  |  |  |  |  |  |  |  |  |  |  |  |  |  |  |  |  |  |  |  |  |  |
| Jun-18 | 4.2 |  |  |  |  |  |  |  |  |  |  |  |  |  |  |  |  |  |  |  |  |  |  |  |  |  |  |  |  |  |  |  |  |  |  |  |  |  |  |  |  |  |  |  |  |  |  |  |  |  |  |
| Jul-18 | 4.1 |  |  |  |  |  |  |  |  |  |  |  |  |  |  |  |  |  |  |  |  |  |  |  |  |  |  |  |  |  |  |  |  |  |  |  |  |  |  |  |  |  |  |  |  |  |  |  |  |  |  |
| Aug-18 | 3.9 |  |  |  |  |  |  |  |  |  |  |  |  |  |  |  |  |  |  |  |  |  |  |  |  |  |  |  |  |  |  |  |  |  |  |  |  |  |  |  |  |  |  |  |  |  |  |  |  |  |  |
| Sep-18 | 3.6 |  |  |  |  |  |  |  |  |  |  |  |  |  |  |  |  |  |  |  |  |  |  |  |  |  |  |  |  |  |  |  |  |  |  |  |  |  |  |  |  |  |  |  |  |  |  |  |  |  |  |
| Oct-18 | 3.5 |  |  |  |  |  |  |  |  |  |  |  |  |  |  |  |  |  |  |  |  |  |  |  |  |  |  |  |  |  |  |  |  |  |  |  |  |  |  |  |  |  |  |  |  |  |  |  |  |  |  |
| Nov-18 | 3.5 |  |  |  |  |  |  |  |  |  |  |  |  |  |  |  |  |  |  |  |  |  |  |  |  |  |  |  |  |  |  |  |  |  |  |  |  |  |  |  |  |  |  |  |  |  |  |  |  |  |  |
| Dec-18 | 3.7 |  |  |  |  |  |  |  |  |  |  |  |  |  |  |  |  |  |  |  |  |  |  |  |  |  |  |  |  |  |  |  |  |  |  |  |  |  |  |  |  |  |  |  |  |  |  |  |  |  |  |
| Jan-19 | 4.4 |  |  |  |  |  |  |  |  |  |  |  |  |  |  |  |  |  |  |  |  |  |  |  |  |  |  |  |  |  |  |  |  |  |  |  |  |  |  |  |  |  |  |  |  |  |  |  |  |  |  |
| Feb-19 | 4.1 |  |  |  |  |  |  |  |  |  |  |  |  |  |  |  |  |  |  |  |  |  |  |  |  |  |  |  |  |  |  |  |  |  |  |  |  |  |  |  |  |  |  |  |  |  |  |  |  |  |  |
| Mar-19 | 3.9 |  |  |  |  |  |  |  |  |  |  |  |  |  |  |  |  |  |  |  |  |  |  |  |  |  |  |  |  |  |  |  |  |  |  |  |  |  |  |  |  |  |  |  |  |  |  |  |  |  |  |
| Apr-19 | 3.3 |  |  |  |  |  |  |  |  |  |  |  |  |  |  |  |  |  |  |  |  |  |  |  |  |  |  |  |  |  |  |  |  |  |  |  |  |  |  |  |  |  |  |  |  |  |  |  |  |  |  |
| May-19 | 3.4 |  |  |  |  |  |  |  |  |  |  |  |  |  |  |  |  |  |  |  |  |  |  |  |  |  |  |  |  |  |  |  |  |  |  |  |  |  |  |  |  |  |  |  |  |  |  |  |  |  |  |
| Jun-19 | 3.8 |  |  |  |  |  |  |  |  |  |  |  |  |  |  |  |  |  |  |  |  |  |  |  |  |  |  |  |  |  |  |  |  |  |  |  |  |  |  |  |  |  |  |  |  |  |  |  |  |  |  |
| Jul-19 | 4 |  |  |  |  |  |  |  |  |  |  |  |  |  |  |  |  |  |  |  |  |  |  |  |  |  |  |  |  |  |  |  |  |  |  |  |  |  |  |  |  |  |  |  |  |  |  |  |  |  |  |
| Aug-19 | 3.8 |  |  |  |  |  |  |  |  |  |  |  |  |  |  |  |  |  |  |  |  |  |  |  |  |  |  |  |  |  |  |  |  |  |  |  |  |  |  |  |  |  |  |  |  |  |  |  |  |  |  |
| Sep-19 | 3.3 |  |  |  |  |  |  |  |  |  |  |  |  |  |  |  |  |  |  |  |  |  |  |  |  |  |  |  |  |  |  |  |  |  |  |  |  |  |  |  |  |  |  |  |  |  |  |  |  |  |  |
| Oct-19 | 3.3 |  |  |  |  |  |  |  |  |  |  |  |  |  |  |  |  |  |  |  |  |  |  |  |  |  |  |  |  |  |  |  |  |  |  |  |  |  |  |  |  |  |  |  |  |  |  |  |  |  |  |
| Nov-19 | 3.3 |  |  |  |  |  |  |  |  |  |  |  |  |  |  |  |  |  |  |  |  |  |  |  |  |  |  |  |  |  |  |  |  |  |  |  |  |  |  |  |  |  |  |  |  |  |  |  |  |  |  |
| Dec-19 | 3.4 |  |  |  |  |  |  |  |  |  |  |  |  |  |  |  |  |  |  |  |  |  |  |  |  |  |  |  |  |  |  |  |  |  |  |  |  |  |  |  |  |  |  |  |  |  |  |  |  |  |  |
| Jan-20 | 4 |  |  |  |  |  |  |  |  |  |  |  |  |  |  |  |  |  |  |  |  |  |  |  |  |  |  |  |  |  |  |  |  |  |  |  |  |  |  |  |  |  |  |  |  |  |  |  |  |  |  |
| Feb-20 | 3.8 |  |  |  |  |  |  |  |  |  |  |  |  |  |  |  |  |  |  |  |  |  |  |  |  |  |  |  |  |  |  |  |  |  |  |  |  |  |  |  |  |  |  |  |  |  |  |  |  |  |  |
| Mar-20 | 4.5 |  |  |  |  |  |  |  |  |  |  |  |  |  |  |  |  |  |  |  |  |  |  |  |  |  |  |  |  |  |  |  |  |  |  |  |  |  |  |  |  |  |  |  |  |  |  |  |  |  |  |
| Apr-20 | 14.4 |  |  |  |  |  |  |  |  |  |  |  |  |  |  |  |  |  |  |  |  |  |  |  |  |  |  |  |  |  |  |  |  |  |  |  |  |  |  |  |  |  |  |  |  |  |  |  |  |  |  |
| May-20 | 13 |  |  |  |  |  |  |  |  |  |  |  |  |  |  |  |  |  |  |  |  |  |  |  |  |  |  |  |  |  |  |  |  |  |  |  |  |  |  |  |  |  |  |  |  |  |  |  |  |  |  |
| Jun-20 | 11.2 |  |  |  |  |  |  |  |  |  |  |  |  |  |  |  |  |  |  |  |  |  |  |  |  |  |  |  |  |  |  |  |  |  |  |  |  |  |  |  |  |  |  |  |  |  |  |  |  |  |  |
| Jul-20 | 10.5 |  |  |  |  |  |  |  |  |  |  |  |  |  |  |  |  |  |  |  |  |  |  |  |  |  |  |  |  |  |  |  |  |  |  |  |  |  |  |  |  |  |  |  |  |  |  |  |  |  |  |
| Aug-20 | 8.5 |  |  |  |  |  |  |  |  |  |  |  |  |  |  |  |  |  |  |  |  |  |  |  |  |  |  |  |  |  |  |  |  |  |  |  |  |  |  |  |  |  |  |  |  |  |  |  |  |  |  |
| Sep-20 | 7.7 |  |  |  |  |  |  |  |  |  |  |  |  |  |  |  |  |  |  |  |  |  |  |  |  |  |  |  |  |  |  |  |  |  |  |  |  |  |  |  |  |  |  |  |  |  |  |  |  |  |  |
| Oct-20 | 6.6 |  |  |  |  |  |  |  |  |  |  |  |  |  |  |  |  |  |  |  |  |  |  |  |  |  |  |  |  |  |  |  |  |  |  |  |  |  |  |  |  |  |  |  |  |  |  |  |  |  |  |
| Nov-20 | 6.4 |  |  |  |  |  |  |  |  |  |  |  |  |  |  |  |  |  |  |  |  |  |  |  |  |  |  |  |  |  |  |  |  |  |  |  |  |  |  |  |  |  |  |  |  |  |  |  |  |  |  |
| Dec-20 | 6.5 |  |  |  |  |  |  |  |  |  |  |  |  |  |  |  |  |  |  |  |  |  |  |  |  |  |  |  |  |  |  |  |  |  |  |  |  |  |  |  |  |  |  |  |  |  |  |  |  |  |  |
| Jan-21 | 6.8 |  |  |  |  |  |  |  |  |  |  |  |  |  |  |  |  |  |  |  |  |  |  |  |  |  |  |  |  |  |  |  |  |  |  |  |  |  |  |  |  |  |  |  |  |  |  |  |  |  |  |
| Feb-21 | 6.6 |  |  |  |  |  |  |  |  |  |  |  |  |  |  |  |  |  |  |  |  |  |  |  |  |  |  |  |  |  |  |  |  |  |  |  |  |  |  |  |  |  |  |  |  |  |  |  |  |  |  |
| Mar-21 | 6.2 |  |  |  |  |  |  |  |  |  |  |  |  |  |  |  |  |  |  |  |  |  |  |  |  |  |  |  |  |  |  |  |  |  |  |  |  |  |  |  |  |  |  |  |  |  |  |  |  |  |  |
| Apr-21 | 5.7 |  |  |  |  |  |  |  |  |  |  |  |  |  |  |  |  |  |  |  |  |  |  |  |  |  |  |  |  |  |  |  |  |  |  |  |  |  |  |  |  |  |  |  |  |  |  |  |  |  |  |
| May-21 | 5.5 |  |  |  |  |  |  |  |  |  |  |  |  |  |  |  |  |  |  |  |  |  |  |  |  |  |  |  |  |  |  |  |  |  |  |  |  |  |  |  |  |  |  |  |  |  |  |  |  |  |  |
| Jun-21 | 6.1 |  |  |  |  |  |  |  |  |  |  |  |  |  |  |  |  |  |  |  |  |  |  |  |  |  |  |  |  |  |  |  |  |  |  |  |  |  |  |  |  |  |  |  |  |  |  |  |  |  |  |
| Jul-21 | 5.7 |  |  |  |  |  |  |  |  |  |  |  |  |  |  |  |  |  |  |  |  |  |  |  |  |  |  |  |  |  |  |  |  |  |  |  |  |  |  |  |  |  |  |  |  |  |  |  |  |  |  |
| Aug-21 | 5.3 |  |  |  |  |  |  |  |  |  |  |  |  |  |  |  |  |  |  |  |  |  |  |  |  |  |  |  |  |  |  |  |  |  |  |  |  |  |  |  |  |  |  |  |  |  |  |  |  |  |  |
| Sep-21 | 4.6 |  |  |  |  |  |  |  |  |  |  |  |  |  |  |  |  |  |  |  |  |  |  |  |  |  |  |  |  |  |  |  |  |  |  |  |  |  |  |  |  |  |  |  |  |  |  |  |  |  |  |
| Oct-21 | 4.3 |  |  |  |  |  |  |  |  |  |  |  |  |  |  |  |  |  |  |  |  |  |  |  |  |  |  |  |  |  |  |  |  |  |  |  |  |  |  |  |  |  |  |  |  |  |  |  |  |  |  |
| Nov-21 | 3.9 |  |  |  |  |  |  |  |  |  |  |  |  |  |  |  |  |  |  |  |  |  |  |  |  |  |  |  |  |  |  |  |  |  |  |  |  |  |  |  |  |  |  |  |  |  |  |  |  |  |  |
| Dec-21 | 3.7 |  |  |  |  |  |  |  |  |  |  |  |  |  |  |  |  |  |  |  |  |  |  |  |  |  |  |  |  |  |  |  |  |  |  |  |  |  |  |  |  |  |  |  |  |  |  |  |  |  |  |
| Jan-22 | 4.4 |  |  |  |  |  |  |  |  |  |  |  |  |  |  |  |  |  |  |  |  |  |  |  |  |  |  |  |  |  |  |  |  |  |  |  |  |  |  |  |  |  |  |  |  |  |  |  |  |  |  |
| Feb-22 | 4.1 |  |  |  |  |  |  |  |  |  |  |  |  |  |  |  |  |  |  |  |  |  |  |  |  |  |  |  |  |  |  |  |  |  |  |  |  |  |  |  |  |  |  |  |  |  |  |  |  |  |  |
| Mar-22 | 3.8 |  |  |  |  |  |  |  |  |  |  |  |  |  |  |  |  |  |  |  |  |  |  |  |  |  |  |  |  |  |  |  |  |  |  |  |  |  |  |  |  |  |  |  |  |  |  |  |  |  |  |
| Apr-22 | 3.3 |  |  |  |  |  |  |  |  |  |  |  |  |  |  |  |  |  |  |  |  |  |  |  |  |  |  |  |  |  |  |  |  |  |  |  |  |  |  |  |  |  |  |  |  |  |  |  |  |  |  |
| May-22 | 3.4 |  |  |  |  |  |  |  |  |  |  |  |  |  |  |  |  |  |  |  |  |  |  |  |  |  |  |  |  |  |  |  |  |  |  |  |  |  |  |  |  |  |  |  |  |  |  |  |  |  |  |
| Jun-22 | 3.8 |  |  |  |  |  |  |  |  |  |  |  |  |  |  |  |  |  |  |  |  |  |  |  |  |  |  |  |  |  |  |  |  |  |  |  |  |  |  |  |  |  |  |  |  |  |  |  |  |  |  |